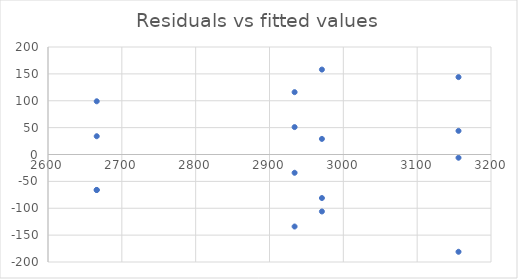
| Category | Series 0 |
|---|---|
| 2971.0 | 158 |
| 2971.0 | 29 |
| 2971.0 | -106 |
| 2971.0 | -81 |
| 3156.0 | 44 |
| 3156.0 | 144 |
| 3156.0 | -181 |
| 3156.0 | -6 |
| 2934.0 | -134 |
| 2934.0 | -34 |
| 2934.0 | 51 |
| 2934.0 | 116 |
| 2666.0 | -66 |
| 2666.0 | 34 |
| 2666.0 | -66 |
| 2666.0 | 99 |